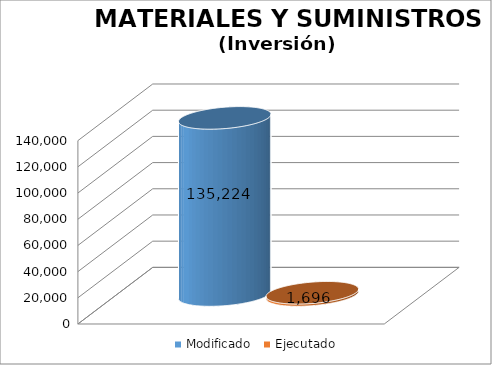
| Category | Modificado | Ejecutado |
|---|---|---|
| 0 | 135224 | 1696.32 |